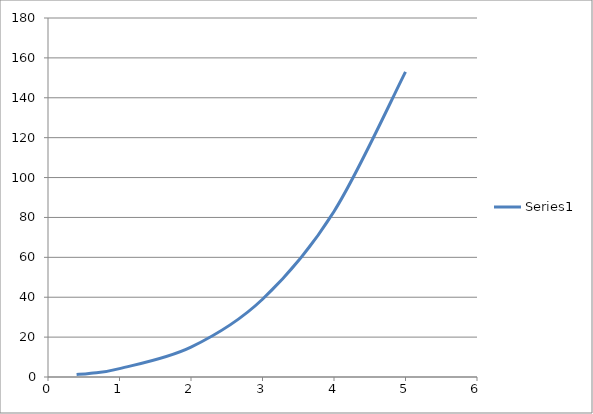
| Category | Series 0 |
|---|---|
| 0.4 | 1.25 |
| 0.6 | 1.9 |
| 1.0 | 4.2 |
| 2.0 | 15 |
| 3.0 | 39 |
| 4.0 | 83 |
| 5.0 | 153 |